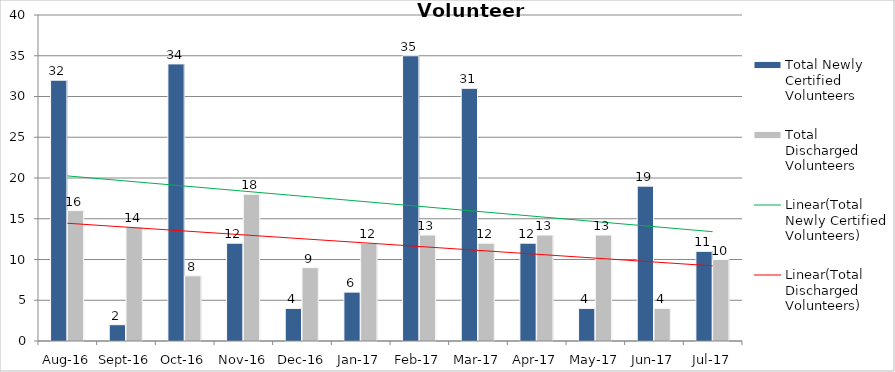
| Category | Total Newly Certified Volunteers | Total Discharged Volunteers |
|---|---|---|
| Aug-16 | 32 | 16 |
| Sep-16 | 2 | 14 |
| Oct-16 | 34 | 8 |
| Nov-16 | 12 | 18 |
| Dec-16 | 4 | 9 |
| Jan-17 | 6 | 12 |
| Feb-17 | 35 | 13 |
| Mar-17 | 31 | 12 |
| Apr-17 | 12 | 13 |
| May-17 | 4 | 13 |
| Jun-17 | 19 | 4 |
| Jul-17 | 11 | 10 |